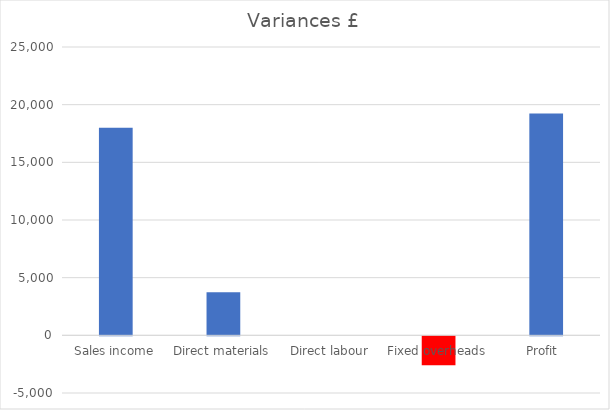
| Category | Series 0 |
|---|---|
| Sales income | 18000 |
| Direct materials | 3730 |
| Direct labour | 0 |
| Fixed overheads | -2500 |
| Profit  | 19230 |